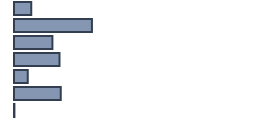
| Category | Percentatge |
|---|---|
| 0 | 7.217 |
| 1 | 32.478 |
| 2 | 16 |
| 3 | 18.957 |
| 4 | 5.696 |
| 5 | 19.478 |
| 6 | 0.174 |